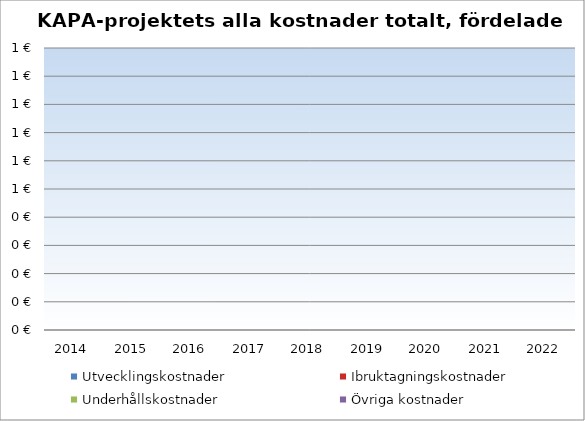
| Category | Utvecklingskostnader | Ibruktagningskostnader | Underhållskostnader | Övriga kostnader |
|---|---|---|---|---|
| 2014.0 | 0 | 0 | 0 | 0 |
| 2015.0 | 0 | 0 | 0 | 0 |
| 2016.0 | 0 | 0 | 0 | 0 |
| 2017.0 | 0 | 0 | 0 | 0 |
| 2018.0 | 0 | 0 | 0 | 0 |
| 2019.0 | 0 | 0 | 0 | 0 |
| 2020.0 | 0 | 0 | 0 | 0 |
| 2021.0 | 0 | 0 | 0 | 0 |
| 2022.0 | 0 | 0 | 0 | 0 |